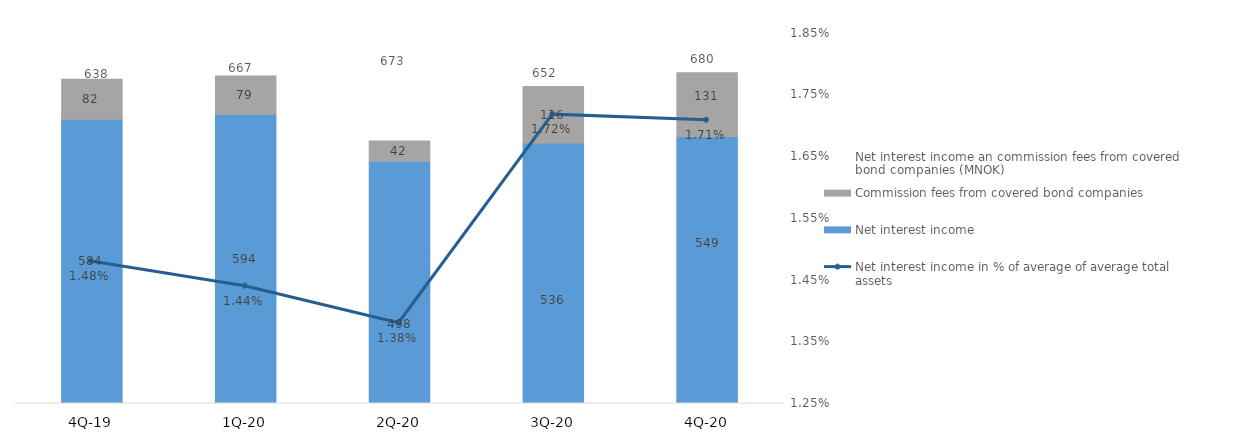
| Category | Net interest income | Commission fees from covered bond companies |
|---|---|---|
| 4Q-20 | 549.138 | 131.015 |
| 3Q-20 | 535.786 | 116.034 |
| 2Q-20 | 498.097 | 41.55 |
| 1Q-20 | 594.469 | 78.983 |
| 4Q-19 | 584.355 | 82.264 |